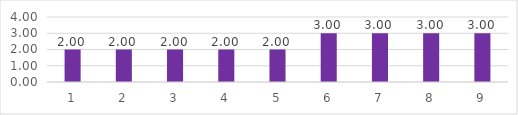
| Category | Series 0 |
|---|---|
| 0 | 2 |
| 1 | 2 |
| 2 | 2 |
| 3 | 2 |
| 4 | 2 |
| 5 | 3 |
| 6 | 3 |
| 7 | 3 |
| 8 | 3 |